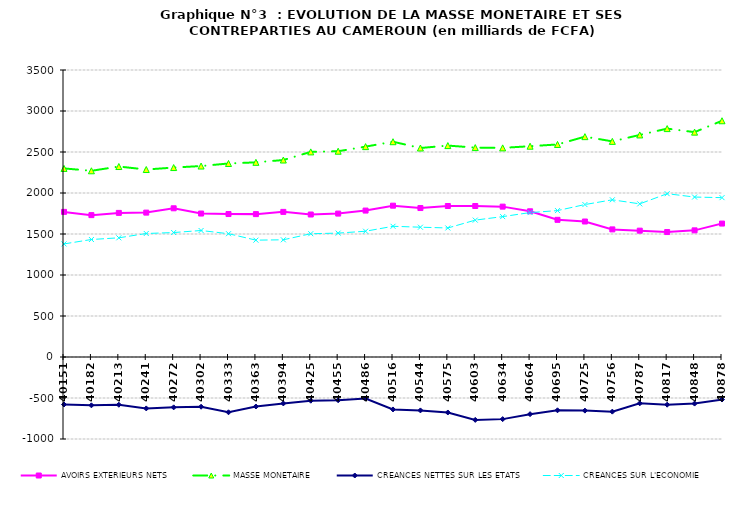
| Category | AVOIRS EXTERIEURS NETS | MASSE MONETAIRE | CREANCES NETTES SUR LES ETATS | CREANCES SUR L'ECONOMIE |
|---|---|---|---|---|
| 40151.0 | 1769653 | 2299804 | -579251 | 1378971 |
| 40182.0 | 1730169 | 2270779 | -589388 | 1432908 |
| 40213.0 | 1757427 | 2322821 | -582226 | 1453479 |
| 40241.0 | 1760853 | 2286290 | -627055 | 1506150 |
| 40272.0 | 1813578 | 2310244 | -614125 | 1517751 |
| 40302.0 | 1749552 | 2328794 | -606391 | 1542596 |
| 40333.0 | 1743471 | 2359980 | -673963 | 1503614 |
| 40363.0 | 1742379 | 2373870 | -603762 | 1425027 |
| 40394.0 | 1769807 | 2402151 | -566133 | 1429288 |
| 40425.0 | 1737666 | 2501311 | -532981 | 1503452 |
| 40455.0 | 1748897 | 2509395 | -527402 | 1510839 |
| 40486.0 | 1785709 | 2565413 | -506818 | 1533825 |
| 40516.0 | 1845375 | 2625411 | -639591 | 1593986 |
| 40544.0 | 1816655 | 2548631 | -651321 | 1582999 |
| 40575.0 | 1841437 | 2578241 | -676456 | 1573463 |
| 40603.0 | 1841442 | 2553779 | -766906 | 1669294 |
| 40634.0 | 1833749 | 2550175 | -757625 | 1712053 |
| 40664.0 | 1776912 | 2570631 | -696911 | 1761151 |
| 40695.0 | 1672814 | 2592029 | -649862 | 1785536 |
| 40725.0 | 1652361 | 2687168 | -653867 | 1859078 |
| 40756.0 | 1556107 | 2629584 | -666284 | 1916953 |
| 40787.0 | 1540609 | 2708066 | -564986 | 1867501 |
| 40817.0 | 1523639 | 2785343 | -581540 | 1991471 |
| 40848.0 | 1544504 | 2742307 | -568162 | 1950639 |
| 40878.0 | 1627286 | 2880922 | -518658 | 1943291 |